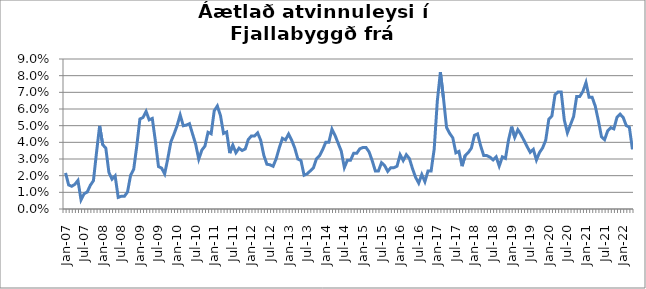
| Category | Series 0 |
|---|---|
| jan.07 | 0.022 |
| feb.07 | 0.014 |
| mar.07 | 0.014 |
| apr.07 | 0.015 |
| maí.07 | 0.017 |
| jún.07 | 0.005 |
| júl.07 | 0.009 |
| ágú.07 | 0.01 |
| sep.07 | 0.014 |
| okt.07 | 0.017 |
| nóv.07 | 0.034 |
| des.07 | 0.05 |
| jan.08 | 0.039 |
| feb.08 | 0.036 |
| mar.08 | 0.022 |
| apr.08 | 0.018 |
| maí.08 | 0.02 |
| jún.08 | 0.007 |
| júl.08 | 0.008 |
| ágú.08 | 0.008 |
| sep.08 | 0.01 |
| okt.08 | 0.02 |
| nóv.08 | 0.024 |
| des.08 | 0.038 |
| jan.09 | 0.054 |
| feb.09 | 0.055 |
| mar.09 | 0.059 |
| apr.09 | 0.053 |
| maí.09 | 0.054 |
| jún.09 | 0.041 |
| júl.09 | 0.025 |
| ágú.09 | 0.025 |
| sep.09 | 0.021 |
| okt.09 | 0.03 |
| nóv.09 | 0.04 |
| des.09 | 0.045 |
| jan.10 | 0.05 |
| feb.10 | 0.056 |
| mar.10 | 0.05 |
| apr.10 | 0.05 |
| maí.10 | 0.051 |
| jún.10 | 0.045 |
| júl.10 | 0.039 |
| ágú.10 | 0.03 |
| sep.10 | 0.035 |
| okt.10 | 0.038 |
| nóv.10 | 0.046 |
| des.10 | 0.045 |
| jan.11 | 0.059 |
| feb.11 | 0.062 |
| mar.11 | 0.056 |
| apr.11 | 0.045 |
| maí.11 | 0.046 |
| jún.11 | 0.034 |
| júl.11 | 0.038 |
| ágú.11 | 0.034 |
| sep.11 | 0.036 |
| okt.11 | 0.035 |
| nóv.11 | 0.036 |
| des.11 | 0.042 |
| jan.12 | 0.044 |
| feb.12 | 0.044 |
| mar.12 | 0.046 |
| apr.12 | 0.041 |
| maí.12 | 0.032 |
| jún.12 | 0.027 |
| júl.12 | 0.027 |
| ágú.12 | 0.026 |
| sep.12 | 0.03 |
| okt.12 | 0.037 |
| nóv.12 | 0.042 |
| des.12 | 0.041 |
| jan.13 | 0.045 |
| feb.13 | 0.041 |
| mar.13 | 0.037 |
| apr.13 | 0.03 |
| maí.13 | 0.029 |
| jún.13 | 0.02 |
| júl.13 | 0.021 |
| ágú.13 | 0.023 |
| sep.13 | 0.025 |
| okt.13 | 0.03 |
| nóv.13 | 0.032 |
| des.13 | 0.036 |
| jan.14 | 0.04 |
| feb.14 | 0.04 |
| mar.14 | 0.048 |
| apr.14 | 0.044 |
| maí.14 | 0.039 |
| jún.14 | 0.035 |
| júl.14 | 0.025 |
| ágú.14 | 0.029 |
| sep.14 | 0.029 |
| okt.14 | 0.033 |
| nóv.14 | 0.033 |
| des.14 | 0.036 |
| jan.15 | 0.037 |
| feb.15 | 0.037 |
| mar.15 | 0.034 |
| apr.15 | 0.029 |
| maí.15 | 0.023 |
| jún.15 | 0.023 |
| júl.15 | 0.028 |
| ágú.15 | 0.026 |
| sep.15 | 0.023 |
| okt.15 | 0.025 |
| nóv.15 | 0.025 |
| des.15 | 0.026 |
| jan.16 | 0.033 |
| feb.16 | 0.029 |
| mar.16 | 0.033 |
| apr.16 | 0.03 |
| maí.16 | 0.024 |
| jún.16 | 0.019 |
| júl.16 | 0.016 |
| ágú.16 | 0.021 |
| sep.16 | 0.016 |
| okt.16 | 0.023 |
| nóv.16 | 0.023 |
| des.16 | 0.036 |
| jan.17 | 0.065 |
| feb.17 | 0.082 |
| mar.17 | 0.066 |
| apr.17 | 0.049 |
| maí.17 | 0.045 |
| jún.17 | 0.043 |
| júl.17 | 0.034 |
| ágú.17 | 0.035 |
| sep.17 | 0.026 |
| okt.17 | 0.032 |
| nóv.17 | 0.034 |
| des.17 | 0.037 |
| jan.18 | 0.044 |
| feb.18 | 0.045 |
| mar.18 | 0.038 |
| apr.18 | 0.032 |
| maí.18 | 0.032 |
| jún.18 | 0.031 |
| júl.18 | 0.029 |
| ágú.18 | 0.031 |
| sep.18 | 0.026 |
| okt.18 | 0.031 |
| nóv.18 | 0.03 |
| des.18 | 0.041 |
| jan.19 | 0.049 |
| feb.19 | 0.043 |
| mar.19 | 0.048 |
| apr.19 | 0.045 |
| maí.19 | 0.041 |
| jún.19 | 0.037 |
| júl.19 | 0.034 |
| ágú.19 | 0.036 |
| sep.19 | 0.029 |
| okt.19 | 0.034 |
| nóv.19 | 0.037 |
| des.19 | 0.041 |
| jan.20 | 0.054 |
| feb.20 | 0.056 |
| mar. 20*** | 0.069 |
| apr.20 | 0.07 |
| maí.20 | 0.07 |
| jún.20 | 0.053 |
| júl.20 | 0.046 |
| ágú.20 | 0.051 |
| sep.20 | 0.055 |
| okt.20 | 0.068 |
| nóv.20 | 0.068 |
| des.20 | 0.071 |
| jan.21 | 0.076 |
| feb.21 | 0.067 |
| mar.21 | 0.067 |
| apr.21 | 0.062 |
| maí.21 | 0.053 |
| jún.21 | 0.043 |
| júl.21 | 0.042 |
| ágú.21 | 0.047 |
| sep.21 | 0.049 |
| okt.21 | 0.048 |
| nóv.21 | 0.055 |
| des.21 | 0.057 |
| jan.22 | 0.055 |
| feb.22 | 0.05 |
| mar.22 | 0.049 |
| apr.22 | 0.036 |